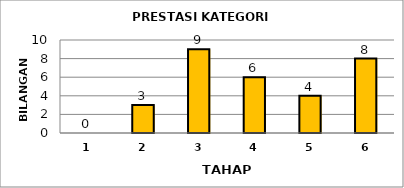
| Category | Series 0 |
|---|---|
| 1.0 | 0 |
| 2.0 | 3 |
| 3.0 | 9 |
| 4.0 | 6 |
| 5.0 | 4 |
| 6.0 | 8 |